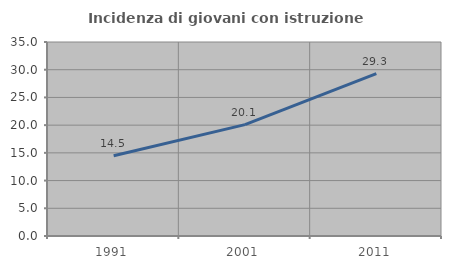
| Category | Incidenza di giovani con istruzione universitaria |
|---|---|
| 1991.0 | 14.465 |
| 2001.0 | 20.093 |
| 2011.0 | 29.282 |